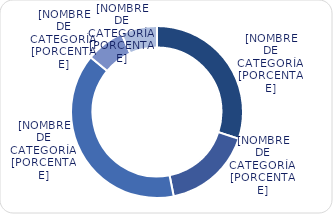
| Category | Series 0 |
|---|---|
| Menores de 3% | 4575.1 |
| Entre 3% y 6% | 2564 |
| Entre 6% y 8% | 5951.5 |
| Entre 8% y 9% | 1101.1 |
| Mayores de 9% | 1034 |